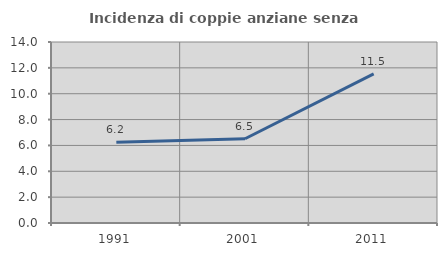
| Category | Incidenza di coppie anziane senza figli  |
|---|---|
| 1991.0 | 6.241 |
| 2001.0 | 6.519 |
| 2011.0 | 11.53 |